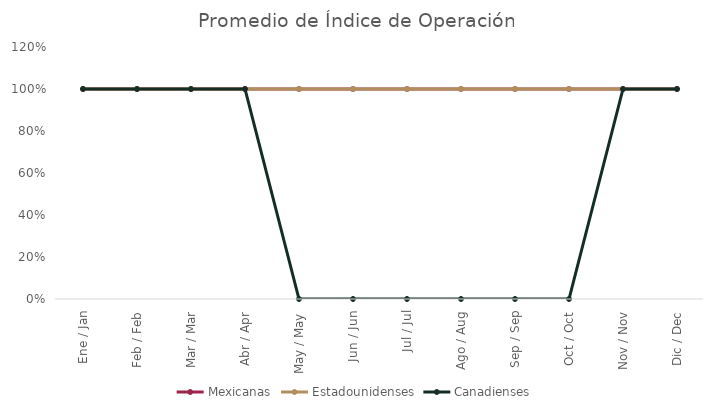
| Category | Mexicanas | Estadounidenses | Canadienses |
|---|---|---|---|
| Ene / Jan | 1 | 1 | 1 |
| Feb / Feb | 1 | 1 | 1 |
| Mar / Mar | 1 | 1 | 1 |
| Abr / Apr | 1 | 1 | 1 |
| May / May | 1 | 1 | 0 |
| Jun / Jun | 1 | 1 | 0 |
| Jul / Jul | 1 | 1 | 0 |
| Ago / Aug | 1 | 1 | 0 |
| Sep / Sep | 1 | 1 | 0 |
| Oct / Oct | 1 | 1 | 0 |
| Nov / Nov | 1 | 1 | 1 |
| Dic / Dec | 1 | 1 | 1 |